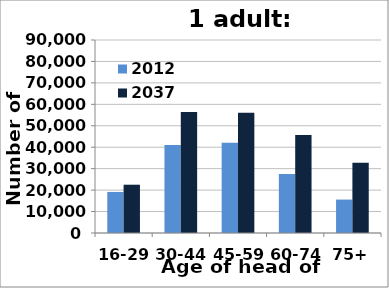
| Category | 2012 | 2037 |
|---|---|---|
| 16-29 | 19145 | 22518 |
| 30-44 | 41080 | 56430 |
| 45-59 | 42094 | 56065 |
| 60-74 | 27509 | 45674 |
| 75+ | 15588 | 32772 |